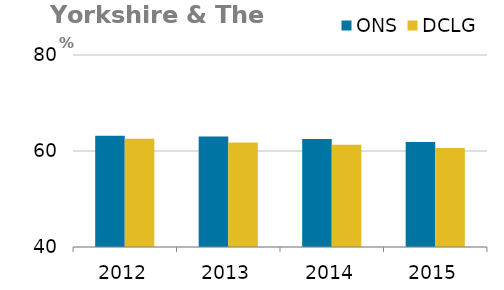
| Category | ONS | DCLG |
|---|---|---|
| 0 | 63.19 | 62.535 |
| 1 | 63.03 | 61.772 |
| 2 | 62.5 | 61.285 |
| 3 | 61.9 | 60.626 |